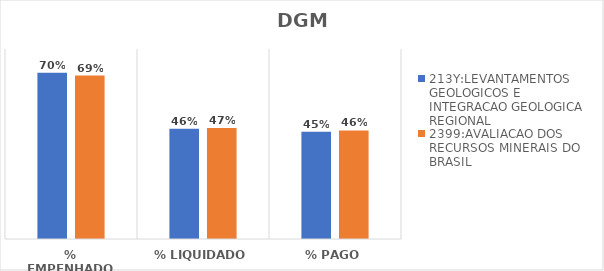
| Category | 213Y:LEVANTAMENTOS GEOLOGICOS E INTEGRACAO GEOLOGICA REGIONAL | 2399:AVALIACAO DOS RECURSOS MINERAIS DO BRASIL |
|---|---|---|
| % EMPENHADO | 0.7 | 0.688 |
| % LIQUIDADO | 0.464 | 0.467 |
| % PAGO | 0.451 | 0.457 |